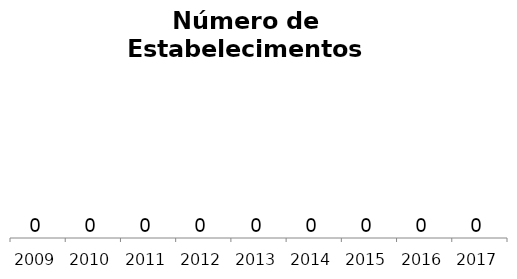
| Category | Transporte Aéreo |
|---|---|
| 2009.0 | 0 |
| 2010.0 | 0 |
| 2011.0 | 0 |
| 2012.0 | 0 |
| 2013.0 | 0 |
| 2014.0 | 0 |
| 2015.0 | 0 |
| 2016.0 | 0 |
| 2017.0 | 0 |